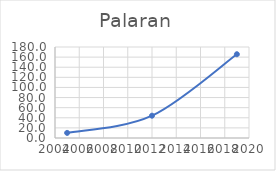
| Category | Series 0 |
|---|---|
| 2005.0 | 10.086 |
| 2012.0 | 44.125 |
| 2019.0 | 165.681 |